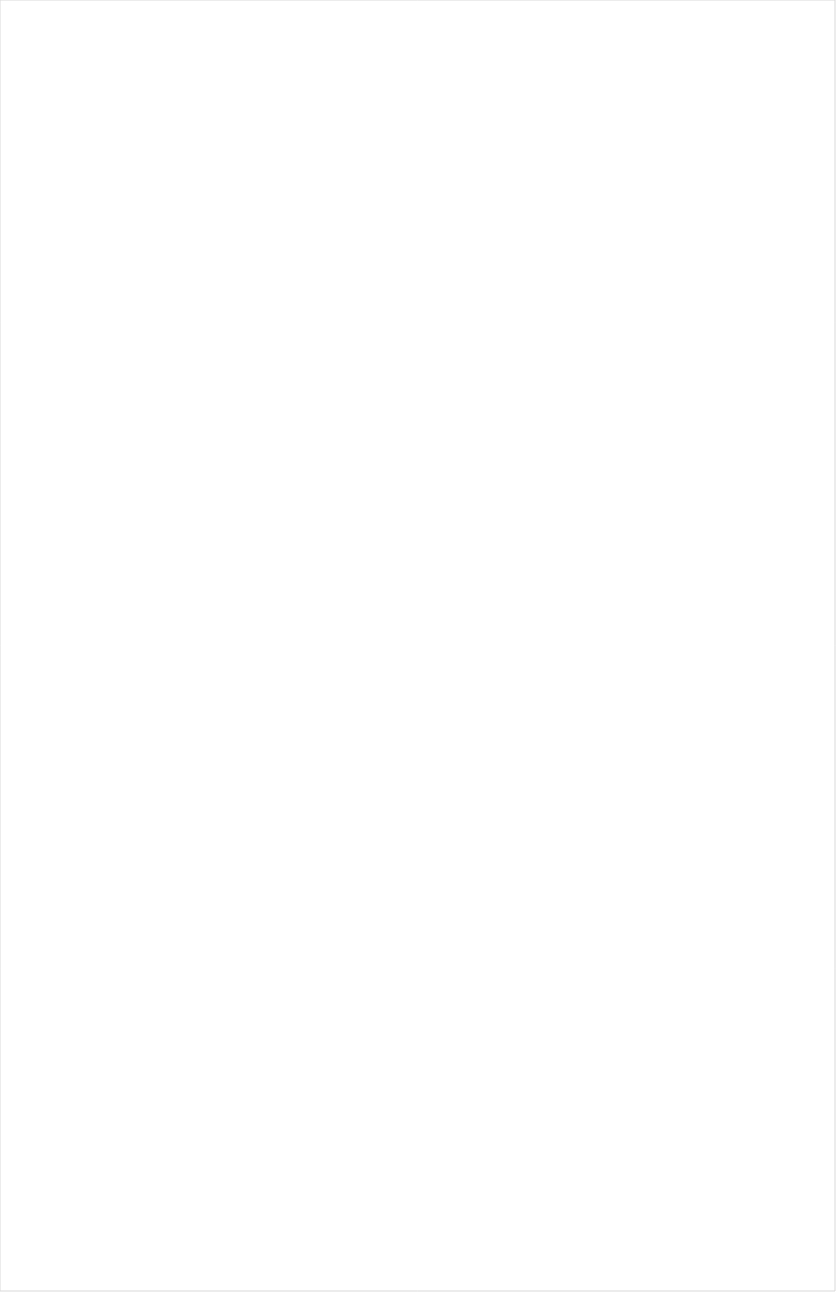
| Category | Total |
|---|---|
| Nick Toons | -0.245 |
| Disney Channel | -0.209 |
| TUDN | -0.201 |
| Nick Jr. | -0.199 |
| Disney XD | -0.194 |
| Disney Junior US | -0.192 |
| Teen Nick | -0.182 |
| VH1 | -0.179 |
| Nick | -0.178 |
| Galavision | -0.173 |
| UniMas | -0.166 |
| Telemundo | -0.166 |
| MTV2 | -0.165 |
| Univision | -0.163 |
| NBC Universo | -0.162 |
| MTV | -0.155 |
| truTV | -0.151 |
| Universal Kids | -0.15 |
| Nick@Nite | -0.15 |
| Adult Swim | -0.145 |
| ESPN Deportes | -0.132 |
| Cartoon Network | -0.132 |
| BET | -0.127 |
| Comedy Central | -0.125 |
| Freeform | -0.115 |
| FX | -0.111 |
| FXX | -0.107 |
| TV ONE | -0.102 |
| E! | -0.099 |
| Viceland | -0.091 |
| NBA TV | -0.09 |
| ESPN | -0.088 |
| Paramount Network | -0.085 |
| ESPN2 | -0.081 |
| BET Her | -0.079 |
| ESPNEWS | -0.077 |
| USA Network | -0.07 |
| BRAVO | -0.068 |
| SYFY | -0.067 |
| TBS | -0.063 |
| TNT | -0.059 |
| Lifetime Movies | -0.051 |
| FXDEP | -0.048 |
| NFL Network | -0.044 |
| ESPNU | -0.041 |
| NHL | -0.038 |
| Independent Film (IFC) | -0.033 |
| Lifetime | -0.029 |
| Discovery Family Channel | -0.027 |
| AMC | -0.022 |
| Fox Sports 1 | -0.022 |
| Travel | -0.02 |
| Food Network | -0.014 |
| Ovation | -0.014 |
| A&E | -0.014 |
| TLC | -0.013 |
| Logo | -0.012 |
| WE TV | -0.012 |
| OXYGEN | -0.012 |
| FX Movie Channel | -0.011 |
| Cooking Channel | -0.01 |
| Discovery Channel | -0.01 |
| Oprah Winfrey Network | -0.009 |
| Discovery Life Channel | -0.008 |
| Big Ten Network | -0.007 |
| CNBC | -0.005 |
| Destination America | -0.004 |
| CW | -0.001 |
| FOX | 0.007 |
| BBC America | 0.013 |
| Investigation Discovery | 0.015 |
| MyNetworkTV | 0.024 |
| National Geographic | 0.028 |
| MLB Network | 0.03 |
| POP | 0.037 |
| NBC Sports | 0.038 |
| Motor Trend Network | 0.038 |
| Game Show | 0.038 |
| The Sportsman Channel | 0.039 |
| Animal Planet | 0.042 |
| FYI | 0.043 |
| CMTV | 0.044 |
| ABC | 0.046 |
| ION | 0.047 |
| Headline News | 0.051 |
| CBS Sports | 0.051 |
| History Channel | 0.054 |
| American Heroes Channel | 0.056 |
| CNN | 0.059 |
| HGTV | 0.06 |
| TV LAND | 0.062 |
| SundanceTV | 0.063 |
| Golf | 0.065 |
| NBC | 0.066 |
| PAC-12 Network | 0.066 |
| DIY | 0.066 |
| Reelz Channel | 0.07 |
| WGN America | 0.072 |
| UP TV | 0.074 |
| Science Channel | 0.084 |
| Outdoor Channel | 0.091 |
| Great American Country | 0.107 |
| Olympic Channel | 0.116 |
| National Geographic Wild | 0.117 |
| CBS | 0.119 |
| Bloomberg HD | 0.131 |
| Fox News | 0.137 |
| Weather Channel | 0.139 |
| Hallmark | 0.145 |
| Smithsonian | 0.158 |
| Tennis Channel | 0.165 |
| MSNBC | 0.187 |
| Fox Business | 0.23 |
| Hallmark Movies & Mysteries | 0.245 |
| PBS | 0.246 |
| INSP | 0.249 |
| RFD TV | 0.313 |